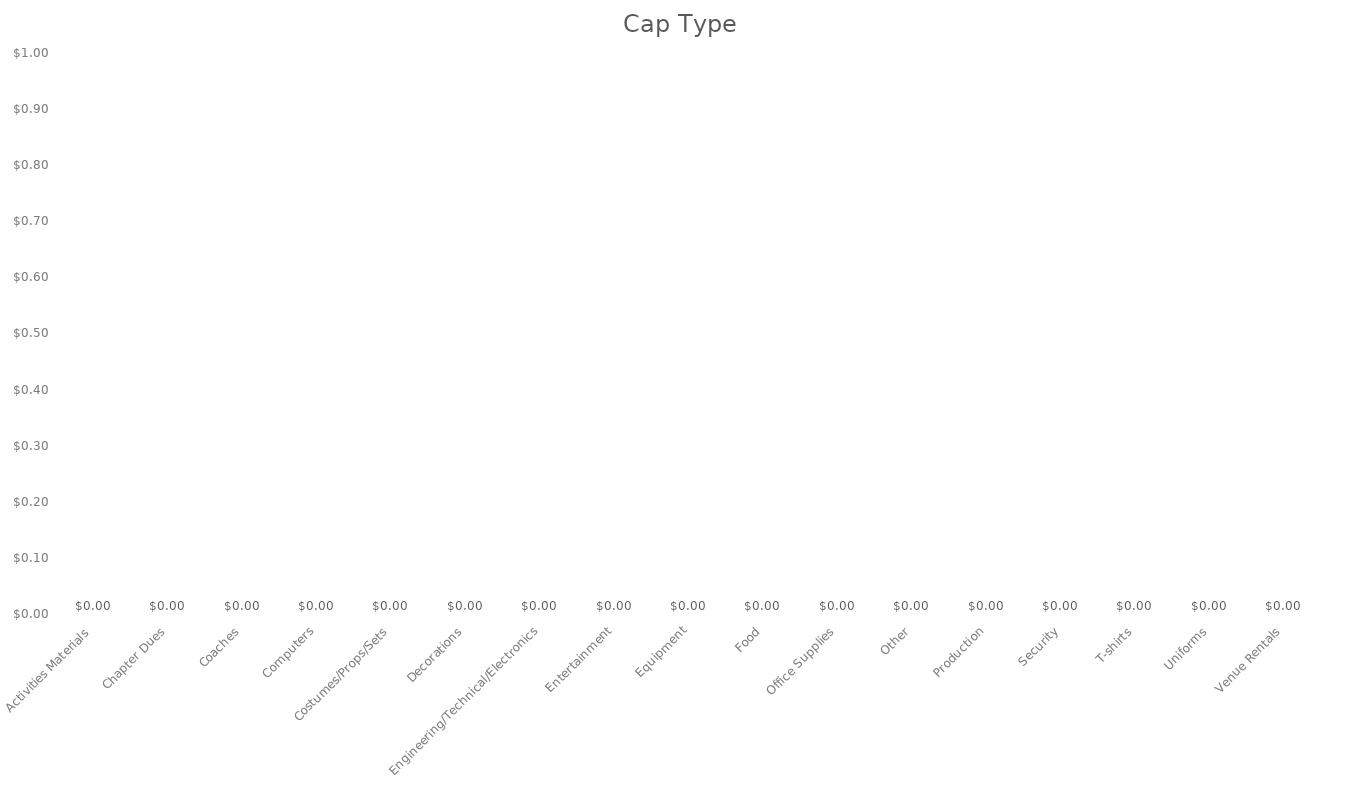
| Category | Cap Type |
|---|---|
| Activities Materials | 0 |
| Chapter Dues | 0 |
| Coaches | 0 |
| Computers | 0 |
| Costumes/Props/Sets | 0 |
| Decorations | 0 |
| Engineering/Technical/Electronics | 0 |
| Entertainment | 0 |
| Equipment | 0 |
| Food | 0 |
| Office Supplies | 0 |
| Other | 0 |
| Production | 0 |
| Security | 0 |
| T-shirts | 0 |
| Uniforms | 0 |
| Venue Rentals | 0 |